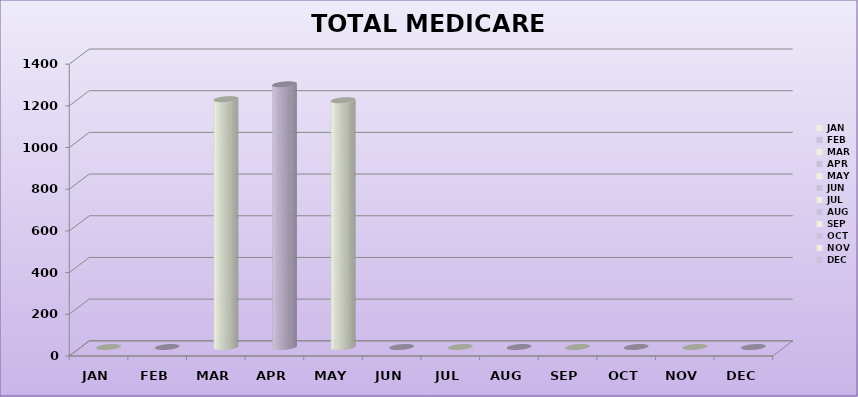
| Category | TOTAL MEDICARE DAYS |
|---|---|
| 0 | 0 |
| 1 | 0 |
| 2 | 1189 |
| 3 | 1260 |
| 4 | 1184 |
| 5 | 0 |
| 6 | 0 |
| 7 | 0 |
| 8 | 0 |
| 9 | 0 |
| 10 | 0 |
| 11 | 0 |